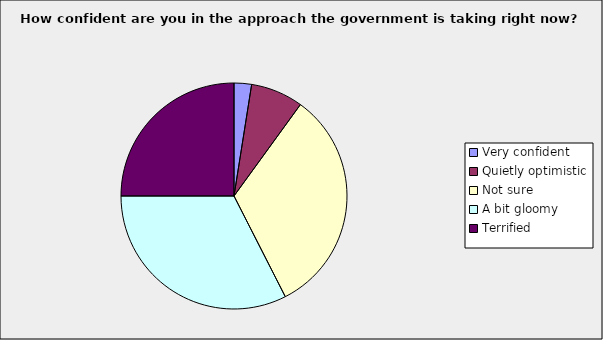
| Category | Series 0 |
|---|---|
| Very confident  | 0.025 |
| Quietly optimistic  | 0.075 |
| Not sure  | 0.325 |
| A bit gloomy  | 0.325 |
| Terrified  | 0.25 |